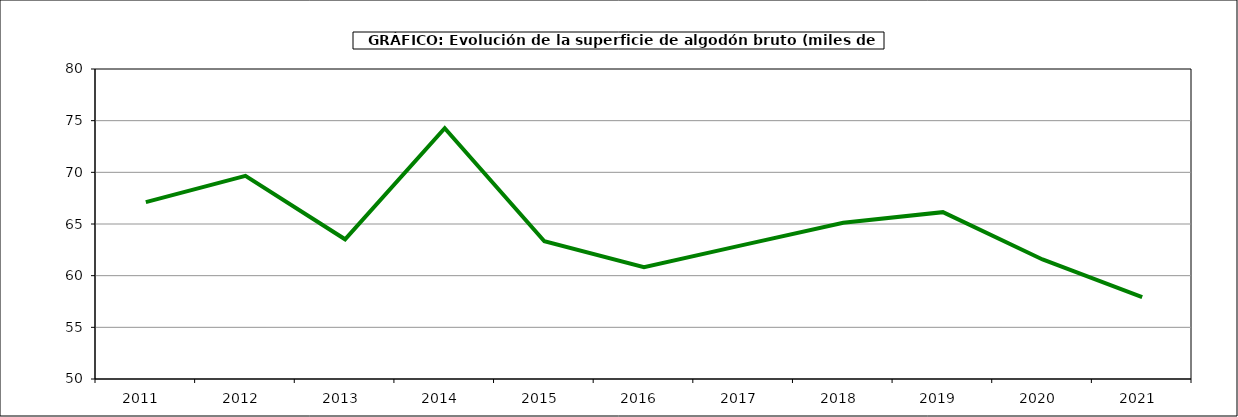
| Category | Superficie |
|---|---|
| 2011.0 | 67.118 |
| 2012.0 | 69.662 |
| 2013.0 | 63.52 |
| 2014.0 | 74.265 |
| 2015.0 | 63.326 |
| 2016.0 | 60.814 |
| 2017.0 | 62.982 |
| 2018.0 | 65.121 |
| 2019.0 | 66.147 |
| 2020.0 | 61.568 |
| 2021.0 | 57.914 |